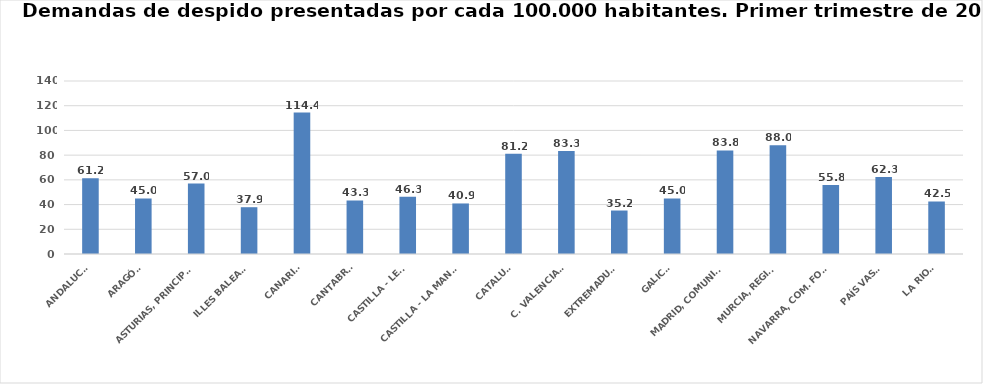
| Category | Series 0 |
|---|---|
| ANDALUCÍA | 61.234 |
| ARAGÓN | 44.985 |
| ASTURIAS, PRINCIPADO | 57.023 |
| ILLES BALEARS | 37.871 |
| CANARIAS | 114.42 |
| CANTABRIA | 43.328 |
| CASTILLA - LEÓN | 46.337 |
| CASTILLA - LA MANCHA | 40.901 |
| CATALUÑA | 81.187 |
| C. VALENCIANA | 83.303 |
| EXTREMADURA | 35.189 |
| GALICIA | 44.968 |
| MADRID, COMUNIDAD | 83.794 |
| MURCIA, REGIÓN | 87.977 |
| NAVARRA, COM. FORAL | 55.787 |
| PAÍS VASCO | 62.255 |
| LA RIOJA | 42.512 |